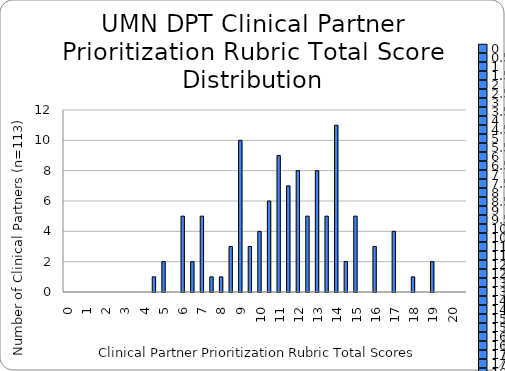
| Category | Series 0 |
|---|---|
| 0.0 | 0 |
| 0.5 | 0 |
| 1.0 | 0 |
| 1.5 | 0 |
| 2.0 | 0 |
| 2.5 | 0 |
| 3.0 | 0 |
| 3.5 | 0 |
| 4.0 | 0 |
| 4.5 | 1 |
| 5.0 | 2 |
| 5.5 | 0 |
| 6.0 | 5 |
| 6.5 | 2 |
| 7.0 | 5 |
| 7.5 | 1 |
| 8.0 | 1 |
| 8.5 | 3 |
| 9.0 | 10 |
| 9.5 | 3 |
| 10.0 | 4 |
| 10.5 | 6 |
| 11.0 | 9 |
| 11.5 | 7 |
| 12.0 | 8 |
| 12.5 | 5 |
| 13.0 | 8 |
| 13.5 | 5 |
| 14.0 | 11 |
| 14.5 | 2 |
| 15.0 | 5 |
| 15.5 | 0 |
| 16.0 | 3 |
| 16.5 | 0 |
| 17.0 | 4 |
| 17.5 | 0 |
| 18.0 | 1 |
| 18.5 | 0 |
| 19.0 | 2 |
| 19.5 | 0 |
| 20.0 | 0 |